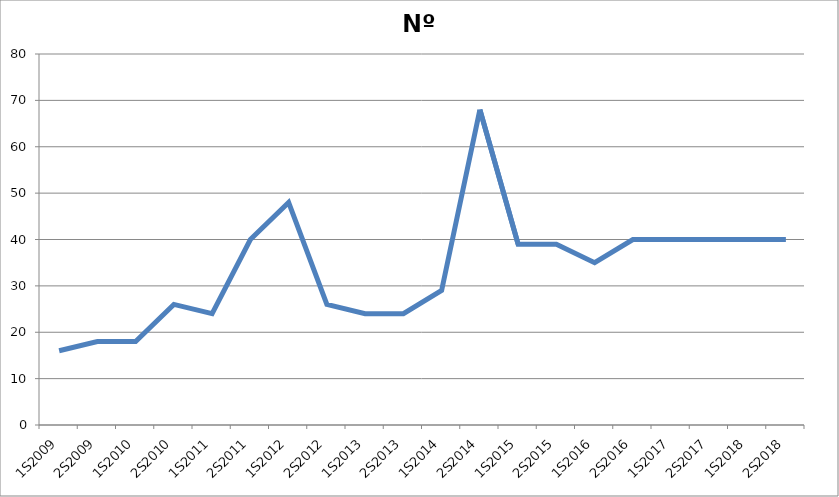
| Category | Nº Videos |
|---|---|
| 1S2009 | 16 |
| 2S2009 | 18 |
| 1S2010 | 18 |
| 2S2010 | 26 |
| 1S2011 | 24 |
| 2S2011 | 40 |
| 1S2012 | 48 |
| 2S2012 | 26 |
| 1S2013 | 24 |
| 2S2013 | 24 |
| 1S2014 | 29 |
| 2S2014 | 68 |
| 1S2015 | 39 |
| 2S2015 | 39 |
| 1S2016 | 35 |
| 2S2016 | 40 |
| 1S2017 | 40 |
| 2S2017 | 40 |
| 1S2018 | 40 |
| 2S2018 | 40 |